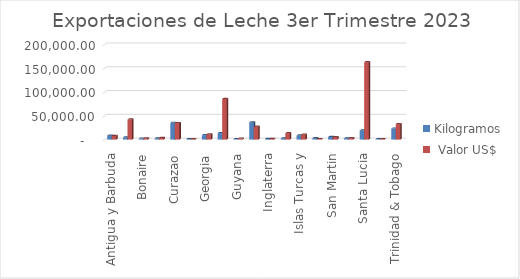
| Category | Kilogramos |  Valor US$ |
|---|---|---|
| Antigua y Barbuda | 8179.47 | 7767.06 |
| Aruba | 4773.12 | 42262.06 |
| Bonaire | 2045.09 | 2437.2 |
| Cuba | 2219.34 | 3481.8 |
| Curazao | 35189.1 | 34750.55 |
| Dominica | 765.45 | 961.5 |
| Georgia | 9390.35 | 10854 |
| Granada | 13648.3 | 85498.22 |
| Guyana | 1111.62 | 2024.92 |
| Haiti | 36083.43 | 27083.84 |
| Inglaterra | 1381.41 | 1243.72 |
| Islas Caiman | 2470.92 | 13413.05 |
| Islas Turcas y Caicos | 8689.32 | 10193.46 |
| Islas Virgenes (U.S.) | 2843.59 | 1131 |
| San Martin | 5446.72 | 5036.96 |
| San Tomas | 2378.9 | 2818.35 |
| Santa Lucia | 19139.52 | 162759.2 |
| Tortola | 696.33 | 847.85 |
| Trinidad & Tobago | 23083.2 | 32676 |